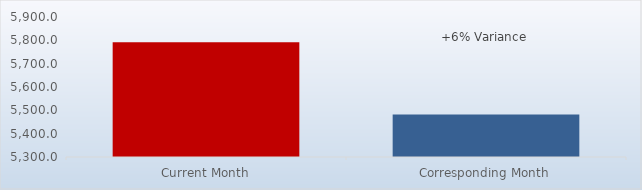
| Category | Average Deposit |
|---|---|
| Current Month | 5791.833 |
| Corresponding Month | 5482.24 |